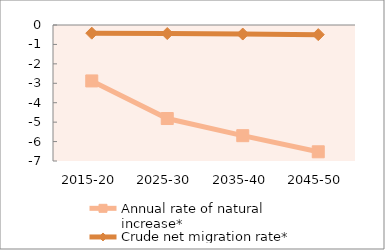
| Category | Annual rate of natural increase* | Crude net migration rate* |
|---|---|---|
| 2015-20 | -2.879 | -0.42 |
| 2025-30 | -4.814 | -0.439 |
| 2035-40 | -5.697 | -0.465 |
| 2045-50 | -6.526 | -0.496 |